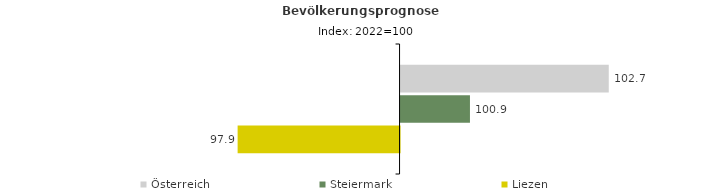
| Category | Österreich | Steiermark | Liezen |
|---|---|---|---|
| 2022.0 | 102.7 | 100.9 | 97.9 |